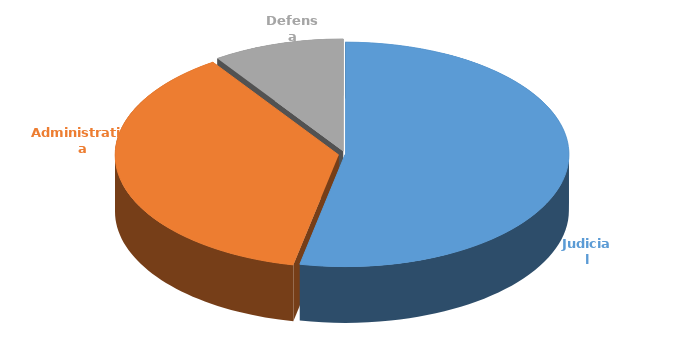
| Category | Cantidad |
|---|---|
| Judicial | 336 |
| Administrativa | 235 |
| Defensa | 60 |